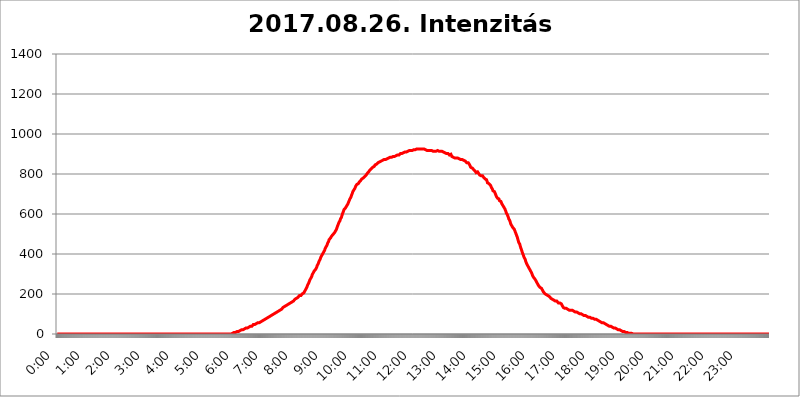
| Category | 2017.08.26. Intenzitás [W/m^2] |
|---|---|
| 0.0 | 0 |
| 0.0006944444444444445 | 0 |
| 0.001388888888888889 | 0 |
| 0.0020833333333333333 | 0 |
| 0.002777777777777778 | 0 |
| 0.003472222222222222 | 0 |
| 0.004166666666666667 | 0 |
| 0.004861111111111111 | 0 |
| 0.005555555555555556 | 0 |
| 0.0062499999999999995 | 0 |
| 0.006944444444444444 | 0 |
| 0.007638888888888889 | 0 |
| 0.008333333333333333 | 0 |
| 0.009027777777777779 | 0 |
| 0.009722222222222222 | 0 |
| 0.010416666666666666 | 0 |
| 0.011111111111111112 | 0 |
| 0.011805555555555555 | 0 |
| 0.012499999999999999 | 0 |
| 0.013194444444444444 | 0 |
| 0.013888888888888888 | 0 |
| 0.014583333333333332 | 0 |
| 0.015277777777777777 | 0 |
| 0.015972222222222224 | 0 |
| 0.016666666666666666 | 0 |
| 0.017361111111111112 | 0 |
| 0.018055555555555557 | 0 |
| 0.01875 | 0 |
| 0.019444444444444445 | 0 |
| 0.02013888888888889 | 0 |
| 0.020833333333333332 | 0 |
| 0.02152777777777778 | 0 |
| 0.022222222222222223 | 0 |
| 0.02291666666666667 | 0 |
| 0.02361111111111111 | 0 |
| 0.024305555555555556 | 0 |
| 0.024999999999999998 | 0 |
| 0.025694444444444447 | 0 |
| 0.02638888888888889 | 0 |
| 0.027083333333333334 | 0 |
| 0.027777777777777776 | 0 |
| 0.02847222222222222 | 0 |
| 0.029166666666666664 | 0 |
| 0.029861111111111113 | 0 |
| 0.030555555555555555 | 0 |
| 0.03125 | 0 |
| 0.03194444444444445 | 0 |
| 0.03263888888888889 | 0 |
| 0.03333333333333333 | 0 |
| 0.034027777777777775 | 0 |
| 0.034722222222222224 | 0 |
| 0.035416666666666666 | 0 |
| 0.036111111111111115 | 0 |
| 0.03680555555555556 | 0 |
| 0.0375 | 0 |
| 0.03819444444444444 | 0 |
| 0.03888888888888889 | 0 |
| 0.03958333333333333 | 0 |
| 0.04027777777777778 | 0 |
| 0.04097222222222222 | 0 |
| 0.041666666666666664 | 0 |
| 0.042361111111111106 | 0 |
| 0.04305555555555556 | 0 |
| 0.043750000000000004 | 0 |
| 0.044444444444444446 | 0 |
| 0.04513888888888889 | 0 |
| 0.04583333333333334 | 0 |
| 0.04652777777777778 | 0 |
| 0.04722222222222222 | 0 |
| 0.04791666666666666 | 0 |
| 0.04861111111111111 | 0 |
| 0.049305555555555554 | 0 |
| 0.049999999999999996 | 0 |
| 0.05069444444444445 | 0 |
| 0.051388888888888894 | 0 |
| 0.052083333333333336 | 0 |
| 0.05277777777777778 | 0 |
| 0.05347222222222222 | 0 |
| 0.05416666666666667 | 0 |
| 0.05486111111111111 | 0 |
| 0.05555555555555555 | 0 |
| 0.05625 | 0 |
| 0.05694444444444444 | 0 |
| 0.057638888888888885 | 0 |
| 0.05833333333333333 | 0 |
| 0.05902777777777778 | 0 |
| 0.059722222222222225 | 0 |
| 0.06041666666666667 | 0 |
| 0.061111111111111116 | 0 |
| 0.06180555555555556 | 0 |
| 0.0625 | 0 |
| 0.06319444444444444 | 0 |
| 0.06388888888888888 | 0 |
| 0.06458333333333334 | 0 |
| 0.06527777777777778 | 0 |
| 0.06597222222222222 | 0 |
| 0.06666666666666667 | 0 |
| 0.06736111111111111 | 0 |
| 0.06805555555555555 | 0 |
| 0.06874999999999999 | 0 |
| 0.06944444444444443 | 0 |
| 0.07013888888888889 | 0 |
| 0.07083333333333333 | 0 |
| 0.07152777777777779 | 0 |
| 0.07222222222222223 | 0 |
| 0.07291666666666667 | 0 |
| 0.07361111111111111 | 0 |
| 0.07430555555555556 | 0 |
| 0.075 | 0 |
| 0.07569444444444444 | 0 |
| 0.0763888888888889 | 0 |
| 0.07708333333333334 | 0 |
| 0.07777777777777778 | 0 |
| 0.07847222222222222 | 0 |
| 0.07916666666666666 | 0 |
| 0.0798611111111111 | 0 |
| 0.08055555555555556 | 0 |
| 0.08125 | 0 |
| 0.08194444444444444 | 0 |
| 0.08263888888888889 | 0 |
| 0.08333333333333333 | 0 |
| 0.08402777777777777 | 0 |
| 0.08472222222222221 | 0 |
| 0.08541666666666665 | 0 |
| 0.08611111111111112 | 0 |
| 0.08680555555555557 | 0 |
| 0.08750000000000001 | 0 |
| 0.08819444444444445 | 0 |
| 0.08888888888888889 | 0 |
| 0.08958333333333333 | 0 |
| 0.09027777777777778 | 0 |
| 0.09097222222222222 | 0 |
| 0.09166666666666667 | 0 |
| 0.09236111111111112 | 0 |
| 0.09305555555555556 | 0 |
| 0.09375 | 0 |
| 0.09444444444444444 | 0 |
| 0.09513888888888888 | 0 |
| 0.09583333333333333 | 0 |
| 0.09652777777777777 | 0 |
| 0.09722222222222222 | 0 |
| 0.09791666666666667 | 0 |
| 0.09861111111111111 | 0 |
| 0.09930555555555555 | 0 |
| 0.09999999999999999 | 0 |
| 0.10069444444444443 | 0 |
| 0.1013888888888889 | 0 |
| 0.10208333333333335 | 0 |
| 0.10277777777777779 | 0 |
| 0.10347222222222223 | 0 |
| 0.10416666666666667 | 0 |
| 0.10486111111111111 | 0 |
| 0.10555555555555556 | 0 |
| 0.10625 | 0 |
| 0.10694444444444444 | 0 |
| 0.1076388888888889 | 0 |
| 0.10833333333333334 | 0 |
| 0.10902777777777778 | 0 |
| 0.10972222222222222 | 0 |
| 0.1111111111111111 | 0 |
| 0.11180555555555556 | 0 |
| 0.11180555555555556 | 0 |
| 0.1125 | 0 |
| 0.11319444444444444 | 0 |
| 0.11388888888888889 | 0 |
| 0.11458333333333333 | 0 |
| 0.11527777777777777 | 0 |
| 0.11597222222222221 | 0 |
| 0.11666666666666665 | 0 |
| 0.1173611111111111 | 0 |
| 0.11805555555555557 | 0 |
| 0.11944444444444445 | 0 |
| 0.12013888888888889 | 0 |
| 0.12083333333333333 | 0 |
| 0.12152777777777778 | 0 |
| 0.12222222222222223 | 0 |
| 0.12291666666666667 | 0 |
| 0.12291666666666667 | 0 |
| 0.12361111111111112 | 0 |
| 0.12430555555555556 | 0 |
| 0.125 | 0 |
| 0.12569444444444444 | 0 |
| 0.12638888888888888 | 0 |
| 0.12708333333333333 | 0 |
| 0.16875 | 0 |
| 0.12847222222222224 | 0 |
| 0.12916666666666668 | 0 |
| 0.12986111111111112 | 0 |
| 0.13055555555555556 | 0 |
| 0.13125 | 0 |
| 0.13194444444444445 | 0 |
| 0.1326388888888889 | 0 |
| 0.13333333333333333 | 0 |
| 0.13402777777777777 | 0 |
| 0.13402777777777777 | 0 |
| 0.13472222222222222 | 0 |
| 0.13541666666666666 | 0 |
| 0.1361111111111111 | 0 |
| 0.13749999999999998 | 0 |
| 0.13819444444444443 | 0 |
| 0.1388888888888889 | 0 |
| 0.13958333333333334 | 0 |
| 0.14027777777777778 | 0 |
| 0.14097222222222222 | 0 |
| 0.14166666666666666 | 0 |
| 0.1423611111111111 | 0 |
| 0.14305555555555557 | 0 |
| 0.14375000000000002 | 0 |
| 0.14444444444444446 | 0 |
| 0.1451388888888889 | 0 |
| 0.1451388888888889 | 0 |
| 0.14652777777777778 | 0 |
| 0.14722222222222223 | 0 |
| 0.14791666666666667 | 0 |
| 0.1486111111111111 | 0 |
| 0.14930555555555555 | 0 |
| 0.15 | 0 |
| 0.15069444444444444 | 0 |
| 0.15138888888888888 | 0 |
| 0.15208333333333332 | 0 |
| 0.15277777777777776 | 0 |
| 0.15347222222222223 | 0 |
| 0.15416666666666667 | 0 |
| 0.15486111111111112 | 0 |
| 0.15555555555555556 | 0 |
| 0.15625 | 0 |
| 0.15694444444444444 | 0 |
| 0.15763888888888888 | 0 |
| 0.15833333333333333 | 0 |
| 0.15902777777777777 | 0 |
| 0.15972222222222224 | 0 |
| 0.16041666666666668 | 0 |
| 0.16111111111111112 | 0 |
| 0.16180555555555556 | 0 |
| 0.1625 | 0 |
| 0.16319444444444445 | 0 |
| 0.1638888888888889 | 0 |
| 0.16458333333333333 | 0 |
| 0.16527777777777777 | 0 |
| 0.16597222222222222 | 0 |
| 0.16666666666666666 | 0 |
| 0.1673611111111111 | 0 |
| 0.16805555555555554 | 0 |
| 0.16874999999999998 | 0 |
| 0.16944444444444443 | 0 |
| 0.17013888888888887 | 0 |
| 0.1708333333333333 | 0 |
| 0.17152777777777775 | 0 |
| 0.17222222222222225 | 0 |
| 0.1729166666666667 | 0 |
| 0.17361111111111113 | 0 |
| 0.17430555555555557 | 0 |
| 0.17500000000000002 | 0 |
| 0.17569444444444446 | 0 |
| 0.1763888888888889 | 0 |
| 0.17708333333333334 | 0 |
| 0.17777777777777778 | 0 |
| 0.17847222222222223 | 0 |
| 0.17916666666666667 | 0 |
| 0.1798611111111111 | 0 |
| 0.18055555555555555 | 0 |
| 0.18125 | 0 |
| 0.18194444444444444 | 0 |
| 0.1826388888888889 | 0 |
| 0.18333333333333335 | 0 |
| 0.1840277777777778 | 0 |
| 0.18472222222222223 | 0 |
| 0.18541666666666667 | 0 |
| 0.18611111111111112 | 0 |
| 0.18680555555555556 | 0 |
| 0.1875 | 0 |
| 0.18819444444444444 | 0 |
| 0.18888888888888888 | 0 |
| 0.18958333333333333 | 0 |
| 0.19027777777777777 | 0 |
| 0.1909722222222222 | 0 |
| 0.19166666666666665 | 0 |
| 0.19236111111111112 | 0 |
| 0.19305555555555554 | 0 |
| 0.19375 | 0 |
| 0.19444444444444445 | 0 |
| 0.1951388888888889 | 0 |
| 0.19583333333333333 | 0 |
| 0.19652777777777777 | 0 |
| 0.19722222222222222 | 0 |
| 0.19791666666666666 | 0 |
| 0.1986111111111111 | 0 |
| 0.19930555555555554 | 0 |
| 0.19999999999999998 | 0 |
| 0.20069444444444443 | 0 |
| 0.20138888888888887 | 0 |
| 0.2020833333333333 | 0 |
| 0.2027777777777778 | 0 |
| 0.2034722222222222 | 0 |
| 0.2041666666666667 | 0 |
| 0.20486111111111113 | 0 |
| 0.20555555555555557 | 0 |
| 0.20625000000000002 | 0 |
| 0.20694444444444446 | 0 |
| 0.2076388888888889 | 0 |
| 0.20833333333333334 | 0 |
| 0.20902777777777778 | 0 |
| 0.20972222222222223 | 0 |
| 0.21041666666666667 | 0 |
| 0.2111111111111111 | 0 |
| 0.21180555555555555 | 0 |
| 0.2125 | 0 |
| 0.21319444444444444 | 0 |
| 0.2138888888888889 | 0 |
| 0.21458333333333335 | 0 |
| 0.2152777777777778 | 0 |
| 0.21597222222222223 | 0 |
| 0.21666666666666667 | 0 |
| 0.21736111111111112 | 0 |
| 0.21805555555555556 | 0 |
| 0.21875 | 0 |
| 0.21944444444444444 | 0 |
| 0.22013888888888888 | 0 |
| 0.22083333333333333 | 0 |
| 0.22152777777777777 | 0 |
| 0.2222222222222222 | 0 |
| 0.22291666666666665 | 0 |
| 0.2236111111111111 | 0 |
| 0.22430555555555556 | 0 |
| 0.225 | 0 |
| 0.22569444444444445 | 0 |
| 0.2263888888888889 | 0 |
| 0.22708333333333333 | 0 |
| 0.22777777777777777 | 0 |
| 0.22847222222222222 | 0 |
| 0.22916666666666666 | 0 |
| 0.2298611111111111 | 0 |
| 0.23055555555555554 | 0 |
| 0.23124999999999998 | 0 |
| 0.23194444444444443 | 0 |
| 0.23263888888888887 | 0 |
| 0.2333333333333333 | 0 |
| 0.2340277777777778 | 0 |
| 0.2347222222222222 | 0 |
| 0.2354166666666667 | 0 |
| 0.23611111111111113 | 0 |
| 0.23680555555555557 | 0 |
| 0.23750000000000002 | 0 |
| 0.23819444444444446 | 0 |
| 0.2388888888888889 | 0 |
| 0.23958333333333334 | 0 |
| 0.24027777777777778 | 0 |
| 0.24097222222222223 | 0 |
| 0.24166666666666667 | 0 |
| 0.2423611111111111 | 0 |
| 0.24305555555555555 | 0 |
| 0.24375 | 0 |
| 0.24444444444444446 | 3.525 |
| 0.24513888888888888 | 3.525 |
| 0.24583333333333335 | 3.525 |
| 0.2465277777777778 | 3.525 |
| 0.24722222222222223 | 3.525 |
| 0.24791666666666667 | 7.887 |
| 0.24861111111111112 | 7.887 |
| 0.24930555555555556 | 7.887 |
| 0.25 | 7.887 |
| 0.25069444444444444 | 12.257 |
| 0.2513888888888889 | 12.257 |
| 0.2520833333333333 | 12.257 |
| 0.25277777777777777 | 12.257 |
| 0.2534722222222222 | 12.257 |
| 0.25416666666666665 | 12.257 |
| 0.2548611111111111 | 16.636 |
| 0.2555555555555556 | 16.636 |
| 0.25625000000000003 | 16.636 |
| 0.2569444444444445 | 16.636 |
| 0.2576388888888889 | 21.024 |
| 0.25833333333333336 | 21.024 |
| 0.2590277777777778 | 21.024 |
| 0.25972222222222224 | 21.024 |
| 0.2604166666666667 | 21.024 |
| 0.2611111111111111 | 21.024 |
| 0.26180555555555557 | 25.419 |
| 0.2625 | 25.419 |
| 0.26319444444444445 | 25.419 |
| 0.2638888888888889 | 29.823 |
| 0.26458333333333334 | 29.823 |
| 0.2652777777777778 | 29.823 |
| 0.2659722222222222 | 29.823 |
| 0.26666666666666666 | 29.823 |
| 0.2673611111111111 | 34.234 |
| 0.26805555555555555 | 34.234 |
| 0.26875 | 34.234 |
| 0.26944444444444443 | 38.653 |
| 0.2701388888888889 | 38.653 |
| 0.2708333333333333 | 38.653 |
| 0.27152777777777776 | 38.653 |
| 0.2722222222222222 | 38.653 |
| 0.27291666666666664 | 38.653 |
| 0.2736111111111111 | 43.079 |
| 0.2743055555555555 | 43.079 |
| 0.27499999999999997 | 47.511 |
| 0.27569444444444446 | 47.511 |
| 0.27638888888888885 | 47.511 |
| 0.27708333333333335 | 47.511 |
| 0.2777777777777778 | 47.511 |
| 0.27847222222222223 | 51.951 |
| 0.2791666666666667 | 51.951 |
| 0.2798611111111111 | 51.951 |
| 0.28055555555555556 | 51.951 |
| 0.28125 | 56.398 |
| 0.28194444444444444 | 56.398 |
| 0.2826388888888889 | 56.398 |
| 0.2833333333333333 | 56.398 |
| 0.28402777777777777 | 60.85 |
| 0.2847222222222222 | 60.85 |
| 0.28541666666666665 | 60.85 |
| 0.28611111111111115 | 65.31 |
| 0.28680555555555554 | 65.31 |
| 0.28750000000000003 | 65.31 |
| 0.2881944444444445 | 69.775 |
| 0.2888888888888889 | 69.775 |
| 0.28958333333333336 | 69.775 |
| 0.2902777777777778 | 74.246 |
| 0.29097222222222224 | 74.246 |
| 0.2916666666666667 | 74.246 |
| 0.2923611111111111 | 74.246 |
| 0.29305555555555557 | 78.722 |
| 0.29375 | 78.722 |
| 0.29444444444444445 | 78.722 |
| 0.2951388888888889 | 83.205 |
| 0.29583333333333334 | 83.205 |
| 0.2965277777777778 | 83.205 |
| 0.2972222222222222 | 83.205 |
| 0.29791666666666666 | 87.692 |
| 0.2986111111111111 | 87.692 |
| 0.29930555555555555 | 92.184 |
| 0.3 | 92.184 |
| 0.30069444444444443 | 92.184 |
| 0.3013888888888889 | 92.184 |
| 0.3020833333333333 | 96.682 |
| 0.30277777777777776 | 96.682 |
| 0.3034722222222222 | 101.184 |
| 0.30416666666666664 | 101.184 |
| 0.3048611111111111 | 101.184 |
| 0.3055555555555555 | 101.184 |
| 0.30624999999999997 | 105.69 |
| 0.3069444444444444 | 105.69 |
| 0.3076388888888889 | 110.201 |
| 0.30833333333333335 | 110.201 |
| 0.3090277777777778 | 110.201 |
| 0.30972222222222223 | 114.716 |
| 0.3104166666666667 | 114.716 |
| 0.3111111111111111 | 119.235 |
| 0.31180555555555556 | 119.235 |
| 0.3125 | 119.235 |
| 0.31319444444444444 | 123.758 |
| 0.3138888888888889 | 123.758 |
| 0.3145833333333333 | 123.758 |
| 0.31527777777777777 | 128.284 |
| 0.3159722222222222 | 128.284 |
| 0.31666666666666665 | 132.814 |
| 0.31736111111111115 | 132.814 |
| 0.31805555555555554 | 132.814 |
| 0.31875000000000003 | 137.347 |
| 0.3194444444444445 | 137.347 |
| 0.3201388888888889 | 137.347 |
| 0.32083333333333336 | 141.884 |
| 0.3215277777777778 | 141.884 |
| 0.32222222222222224 | 146.423 |
| 0.3229166666666667 | 146.423 |
| 0.3236111111111111 | 146.423 |
| 0.32430555555555557 | 150.964 |
| 0.325 | 150.964 |
| 0.32569444444444445 | 150.964 |
| 0.3263888888888889 | 155.509 |
| 0.32708333333333334 | 155.509 |
| 0.3277777777777778 | 155.509 |
| 0.3284722222222222 | 160.056 |
| 0.32916666666666666 | 160.056 |
| 0.3298611111111111 | 164.605 |
| 0.33055555555555555 | 164.605 |
| 0.33125 | 164.605 |
| 0.33194444444444443 | 169.156 |
| 0.3326388888888889 | 169.156 |
| 0.3333333333333333 | 173.709 |
| 0.3340277777777778 | 173.709 |
| 0.3347222222222222 | 178.264 |
| 0.3354166666666667 | 178.264 |
| 0.3361111111111111 | 178.264 |
| 0.3368055555555556 | 182.82 |
| 0.33749999999999997 | 182.82 |
| 0.33819444444444446 | 187.378 |
| 0.33888888888888885 | 187.378 |
| 0.33958333333333335 | 191.937 |
| 0.34027777777777773 | 191.937 |
| 0.34097222222222223 | 191.937 |
| 0.3416666666666666 | 191.937 |
| 0.3423611111111111 | 196.497 |
| 0.3430555555555555 | 196.497 |
| 0.34375 | 201.058 |
| 0.3444444444444445 | 201.058 |
| 0.3451388888888889 | 201.058 |
| 0.3458333333333334 | 205.62 |
| 0.34652777777777777 | 210.182 |
| 0.34722222222222227 | 214.746 |
| 0.34791666666666665 | 219.309 |
| 0.34861111111111115 | 223.873 |
| 0.34930555555555554 | 228.436 |
| 0.35000000000000003 | 233 |
| 0.3506944444444444 | 237.564 |
| 0.3513888888888889 | 246.689 |
| 0.3520833333333333 | 251.251 |
| 0.3527777777777778 | 255.813 |
| 0.3534722222222222 | 260.373 |
| 0.3541666666666667 | 269.49 |
| 0.3548611111111111 | 274.047 |
| 0.35555555555555557 | 278.603 |
| 0.35625 | 283.156 |
| 0.35694444444444445 | 287.709 |
| 0.3576388888888889 | 296.808 |
| 0.35833333333333334 | 301.354 |
| 0.3590277777777778 | 305.898 |
| 0.3597222222222222 | 310.44 |
| 0.36041666666666666 | 314.98 |
| 0.3611111111111111 | 314.98 |
| 0.36180555555555555 | 319.517 |
| 0.3625 | 324.052 |
| 0.36319444444444443 | 328.584 |
| 0.3638888888888889 | 333.113 |
| 0.3645833333333333 | 342.162 |
| 0.3652777777777778 | 346.682 |
| 0.3659722222222222 | 351.198 |
| 0.3666666666666667 | 355.712 |
| 0.3673611111111111 | 364.728 |
| 0.3680555555555556 | 369.23 |
| 0.36874999999999997 | 373.729 |
| 0.36944444444444446 | 382.715 |
| 0.37013888888888885 | 387.202 |
| 0.37083333333333335 | 391.685 |
| 0.37152777777777773 | 396.164 |
| 0.37222222222222223 | 400.638 |
| 0.3729166666666666 | 405.108 |
| 0.3736111111111111 | 409.574 |
| 0.3743055555555555 | 414.035 |
| 0.375 | 418.492 |
| 0.3756944444444445 | 427.39 |
| 0.3763888888888889 | 431.833 |
| 0.3770833333333334 | 436.27 |
| 0.37777777777777777 | 440.702 |
| 0.37847222222222227 | 445.129 |
| 0.37916666666666665 | 453.968 |
| 0.37986111111111115 | 458.38 |
| 0.38055555555555554 | 462.786 |
| 0.38125000000000003 | 471.582 |
| 0.3819444444444444 | 475.972 |
| 0.3826388888888889 | 475.972 |
| 0.3833333333333333 | 480.356 |
| 0.3840277777777778 | 480.356 |
| 0.3847222222222222 | 489.108 |
| 0.3854166666666667 | 489.108 |
| 0.3861111111111111 | 493.475 |
| 0.38680555555555557 | 497.836 |
| 0.3875 | 497.836 |
| 0.38819444444444445 | 502.192 |
| 0.3888888888888889 | 506.542 |
| 0.38958333333333334 | 510.885 |
| 0.3902777777777778 | 515.223 |
| 0.3909722222222222 | 519.555 |
| 0.39166666666666666 | 523.88 |
| 0.3923611111111111 | 532.513 |
| 0.39305555555555555 | 536.82 |
| 0.39375 | 545.416 |
| 0.39444444444444443 | 549.704 |
| 0.3951388888888889 | 558.261 |
| 0.3958333333333333 | 562.53 |
| 0.3965277777777778 | 566.793 |
| 0.3972222222222222 | 575.299 |
| 0.3979166666666667 | 579.542 |
| 0.3986111111111111 | 583.779 |
| 0.3993055555555556 | 592.233 |
| 0.39999999999999997 | 600.661 |
| 0.40069444444444446 | 604.864 |
| 0.40138888888888885 | 613.252 |
| 0.40208333333333335 | 621.613 |
| 0.40277777777777773 | 625.784 |
| 0.40347222222222223 | 625.784 |
| 0.4041666666666666 | 629.948 |
| 0.4048611111111111 | 634.105 |
| 0.4055555555555555 | 634.105 |
| 0.40625 | 642.4 |
| 0.4069444444444445 | 646.537 |
| 0.4076388888888889 | 650.667 |
| 0.4083333333333334 | 654.791 |
| 0.40902777777777777 | 663.019 |
| 0.40972222222222227 | 667.123 |
| 0.41041666666666665 | 675.311 |
| 0.41111111111111115 | 679.395 |
| 0.41180555555555554 | 683.473 |
| 0.41250000000000003 | 691.608 |
| 0.4131944444444444 | 695.666 |
| 0.4138888888888889 | 703.762 |
| 0.4145833333333333 | 711.832 |
| 0.4152777777777778 | 715.858 |
| 0.4159722222222222 | 719.877 |
| 0.4166666666666667 | 723.889 |
| 0.4173611111111111 | 727.896 |
| 0.41805555555555557 | 731.896 |
| 0.41875 | 739.877 |
| 0.41944444444444445 | 743.859 |
| 0.4201388888888889 | 747.834 |
| 0.42083333333333334 | 747.834 |
| 0.4215277777777778 | 751.803 |
| 0.4222222222222222 | 751.803 |
| 0.42291666666666666 | 755.766 |
| 0.4236111111111111 | 759.723 |
| 0.42430555555555555 | 759.723 |
| 0.425 | 763.674 |
| 0.42569444444444443 | 767.62 |
| 0.4263888888888889 | 771.559 |
| 0.4270833333333333 | 775.492 |
| 0.4277777777777778 | 775.492 |
| 0.4284722222222222 | 775.492 |
| 0.4291666666666667 | 779.42 |
| 0.4298611111111111 | 783.342 |
| 0.4305555555555556 | 783.342 |
| 0.43124999999999997 | 787.258 |
| 0.43194444444444446 | 791.169 |
| 0.43263888888888885 | 791.169 |
| 0.43333333333333335 | 795.074 |
| 0.43402777777777773 | 798.974 |
| 0.43472222222222223 | 802.868 |
| 0.4354166666666666 | 806.757 |
| 0.4361111111111111 | 806.757 |
| 0.4368055555555555 | 810.641 |
| 0.4375 | 814.519 |
| 0.4381944444444445 | 818.392 |
| 0.4388888888888889 | 822.26 |
| 0.4395833333333334 | 822.26 |
| 0.44027777777777777 | 826.123 |
| 0.44097222222222227 | 826.123 |
| 0.44166666666666665 | 829.981 |
| 0.44236111111111115 | 833.834 |
| 0.44305555555555554 | 833.834 |
| 0.44375000000000003 | 837.682 |
| 0.4444444444444444 | 837.682 |
| 0.4451388888888889 | 841.526 |
| 0.4458333333333333 | 845.365 |
| 0.4465277777777778 | 845.365 |
| 0.4472222222222222 | 849.199 |
| 0.4479166666666667 | 849.199 |
| 0.4486111111111111 | 849.199 |
| 0.44930555555555557 | 853.029 |
| 0.45 | 856.855 |
| 0.45069444444444445 | 860.676 |
| 0.4513888888888889 | 860.676 |
| 0.45208333333333334 | 860.676 |
| 0.4527777777777778 | 860.676 |
| 0.4534722222222222 | 864.493 |
| 0.45416666666666666 | 864.493 |
| 0.4548611111111111 | 864.493 |
| 0.45555555555555555 | 868.305 |
| 0.45625 | 868.305 |
| 0.45694444444444443 | 868.305 |
| 0.4576388888888889 | 872.114 |
| 0.4583333333333333 | 872.114 |
| 0.4590277777777778 | 872.114 |
| 0.4597222222222222 | 875.918 |
| 0.4604166666666667 | 872.114 |
| 0.4611111111111111 | 875.918 |
| 0.4618055555555556 | 875.918 |
| 0.46249999999999997 | 875.918 |
| 0.46319444444444446 | 875.918 |
| 0.46388888888888885 | 879.719 |
| 0.46458333333333335 | 879.719 |
| 0.46527777777777773 | 883.516 |
| 0.46597222222222223 | 879.719 |
| 0.4666666666666666 | 883.516 |
| 0.4673611111111111 | 883.516 |
| 0.4680555555555555 | 883.516 |
| 0.46875 | 883.516 |
| 0.4694444444444445 | 887.309 |
| 0.4701388888888889 | 887.309 |
| 0.4708333333333334 | 887.309 |
| 0.47152777777777777 | 887.309 |
| 0.47222222222222227 | 887.309 |
| 0.47291666666666665 | 887.309 |
| 0.47361111111111115 | 887.309 |
| 0.47430555555555554 | 887.309 |
| 0.47500000000000003 | 891.099 |
| 0.4756944444444444 | 894.885 |
| 0.4763888888888889 | 894.885 |
| 0.4770833333333333 | 894.885 |
| 0.4777777777777778 | 894.885 |
| 0.4784722222222222 | 894.885 |
| 0.4791666666666667 | 894.885 |
| 0.4798611111111111 | 898.668 |
| 0.48055555555555557 | 898.668 |
| 0.48125 | 902.447 |
| 0.48194444444444445 | 902.447 |
| 0.4826388888888889 | 902.447 |
| 0.48333333333333334 | 902.447 |
| 0.4840277777777778 | 902.447 |
| 0.4847222222222222 | 906.223 |
| 0.48541666666666666 | 906.223 |
| 0.4861111111111111 | 906.223 |
| 0.48680555555555555 | 909.996 |
| 0.4875 | 909.996 |
| 0.48819444444444443 | 909.996 |
| 0.4888888888888889 | 909.996 |
| 0.4895833333333333 | 909.996 |
| 0.4902777777777778 | 913.766 |
| 0.4909722222222222 | 913.766 |
| 0.4916666666666667 | 913.766 |
| 0.4923611111111111 | 917.534 |
| 0.4930555555555556 | 917.534 |
| 0.49374999999999997 | 917.534 |
| 0.49444444444444446 | 917.534 |
| 0.49513888888888885 | 917.534 |
| 0.49583333333333335 | 917.534 |
| 0.49652777777777773 | 917.534 |
| 0.49722222222222223 | 917.534 |
| 0.4979166666666666 | 917.534 |
| 0.4986111111111111 | 921.298 |
| 0.4993055555555555 | 921.298 |
| 0.5 | 921.298 |
| 0.5006944444444444 | 921.298 |
| 0.5013888888888889 | 921.298 |
| 0.5020833333333333 | 921.298 |
| 0.5027777777777778 | 925.06 |
| 0.5034722222222222 | 921.298 |
| 0.5041666666666667 | 925.06 |
| 0.5048611111111111 | 925.06 |
| 0.5055555555555555 | 925.06 |
| 0.50625 | 925.06 |
| 0.5069444444444444 | 925.06 |
| 0.5076388888888889 | 925.06 |
| 0.5083333333333333 | 925.06 |
| 0.5090277777777777 | 928.819 |
| 0.5097222222222222 | 925.06 |
| 0.5104166666666666 | 925.06 |
| 0.5111111111111112 | 925.06 |
| 0.5118055555555555 | 925.06 |
| 0.5125000000000001 | 925.06 |
| 0.5131944444444444 | 925.06 |
| 0.513888888888889 | 925.06 |
| 0.5145833333333333 | 925.06 |
| 0.5152777777777778 | 921.298 |
| 0.5159722222222222 | 921.298 |
| 0.5166666666666667 | 921.298 |
| 0.517361111111111 | 921.298 |
| 0.5180555555555556 | 921.298 |
| 0.5187499999999999 | 917.534 |
| 0.5194444444444445 | 917.534 |
| 0.5201388888888888 | 917.534 |
| 0.5208333333333334 | 917.534 |
| 0.5215277777777778 | 917.534 |
| 0.5222222222222223 | 917.534 |
| 0.5229166666666667 | 917.534 |
| 0.5236111111111111 | 917.534 |
| 0.5243055555555556 | 917.534 |
| 0.525 | 917.534 |
| 0.5256944444444445 | 917.534 |
| 0.5263888888888889 | 913.766 |
| 0.5270833333333333 | 913.766 |
| 0.5277777777777778 | 913.766 |
| 0.5284722222222222 | 913.766 |
| 0.5291666666666667 | 913.766 |
| 0.5298611111111111 | 913.766 |
| 0.5305555555555556 | 913.766 |
| 0.53125 | 913.766 |
| 0.5319444444444444 | 917.534 |
| 0.5326388888888889 | 917.534 |
| 0.5333333333333333 | 917.534 |
| 0.5340277777777778 | 913.766 |
| 0.5347222222222222 | 913.766 |
| 0.5354166666666667 | 913.766 |
| 0.5361111111111111 | 913.766 |
| 0.5368055555555555 | 913.766 |
| 0.5375 | 913.766 |
| 0.5381944444444444 | 913.766 |
| 0.5388888888888889 | 913.766 |
| 0.5395833333333333 | 913.766 |
| 0.5402777777777777 | 909.996 |
| 0.5409722222222222 | 909.996 |
| 0.5416666666666666 | 909.996 |
| 0.5423611111111112 | 909.996 |
| 0.5430555555555555 | 906.223 |
| 0.5437500000000001 | 906.223 |
| 0.5444444444444444 | 902.447 |
| 0.545138888888889 | 902.447 |
| 0.5458333333333333 | 902.447 |
| 0.5465277777777778 | 902.447 |
| 0.5472222222222222 | 902.447 |
| 0.5479166666666667 | 902.447 |
| 0.548611111111111 | 902.447 |
| 0.5493055555555556 | 898.668 |
| 0.5499999999999999 | 894.885 |
| 0.5506944444444445 | 894.885 |
| 0.5513888888888888 | 894.885 |
| 0.5520833333333334 | 898.668 |
| 0.5527777777777778 | 894.885 |
| 0.5534722222222223 | 887.309 |
| 0.5541666666666667 | 887.309 |
| 0.5548611111111111 | 883.516 |
| 0.5555555555555556 | 883.516 |
| 0.55625 | 883.516 |
| 0.5569444444444445 | 883.516 |
| 0.5576388888888889 | 879.719 |
| 0.5583333333333333 | 875.918 |
| 0.5590277777777778 | 879.719 |
| 0.5597222222222222 | 879.719 |
| 0.5604166666666667 | 879.719 |
| 0.5611111111111111 | 879.719 |
| 0.5618055555555556 | 879.719 |
| 0.5625 | 879.719 |
| 0.5631944444444444 | 879.719 |
| 0.5638888888888889 | 875.918 |
| 0.5645833333333333 | 875.918 |
| 0.5652777777777778 | 875.918 |
| 0.5659722222222222 | 872.114 |
| 0.5666666666666667 | 875.918 |
| 0.5673611111111111 | 875.918 |
| 0.5680555555555555 | 872.114 |
| 0.56875 | 872.114 |
| 0.5694444444444444 | 868.305 |
| 0.5701388888888889 | 868.305 |
| 0.5708333333333333 | 868.305 |
| 0.5715277777777777 | 864.493 |
| 0.5722222222222222 | 864.493 |
| 0.5729166666666666 | 860.676 |
| 0.5736111111111112 | 860.676 |
| 0.5743055555555555 | 856.855 |
| 0.5750000000000001 | 856.855 |
| 0.5756944444444444 | 856.855 |
| 0.576388888888889 | 856.855 |
| 0.5770833333333333 | 853.029 |
| 0.5777777777777778 | 853.029 |
| 0.5784722222222222 | 845.365 |
| 0.5791666666666667 | 841.526 |
| 0.579861111111111 | 833.834 |
| 0.5805555555555556 | 833.834 |
| 0.5812499999999999 | 833.834 |
| 0.5819444444444445 | 829.981 |
| 0.5826388888888888 | 826.123 |
| 0.5833333333333334 | 826.123 |
| 0.5840277777777778 | 822.26 |
| 0.5847222222222223 | 818.392 |
| 0.5854166666666667 | 818.392 |
| 0.5861111111111111 | 814.519 |
| 0.5868055555555556 | 810.641 |
| 0.5875 | 806.757 |
| 0.5881944444444445 | 806.757 |
| 0.5888888888888889 | 810.641 |
| 0.5895833333333333 | 810.641 |
| 0.5902777777777778 | 806.757 |
| 0.5909722222222222 | 802.868 |
| 0.5916666666666667 | 798.974 |
| 0.5923611111111111 | 795.074 |
| 0.5930555555555556 | 795.074 |
| 0.59375 | 795.074 |
| 0.5944444444444444 | 791.169 |
| 0.5951388888888889 | 791.169 |
| 0.5958333333333333 | 787.258 |
| 0.5965277777777778 | 791.169 |
| 0.5972222222222222 | 787.258 |
| 0.5979166666666667 | 783.342 |
| 0.5986111111111111 | 779.42 |
| 0.5993055555555555 | 779.42 |
| 0.6 | 775.492 |
| 0.6006944444444444 | 775.492 |
| 0.6013888888888889 | 775.492 |
| 0.6020833333333333 | 771.559 |
| 0.6027777777777777 | 763.674 |
| 0.6034722222222222 | 755.766 |
| 0.6041666666666666 | 755.766 |
| 0.6048611111111112 | 751.803 |
| 0.6055555555555555 | 751.803 |
| 0.6062500000000001 | 751.803 |
| 0.6069444444444444 | 747.834 |
| 0.607638888888889 | 743.859 |
| 0.6083333333333333 | 739.877 |
| 0.6090277777777778 | 731.896 |
| 0.6097222222222222 | 727.896 |
| 0.6104166666666667 | 723.889 |
| 0.611111111111111 | 715.858 |
| 0.6118055555555556 | 719.877 |
| 0.6124999999999999 | 711.832 |
| 0.6131944444444445 | 711.832 |
| 0.6138888888888888 | 707.8 |
| 0.6145833333333334 | 699.717 |
| 0.6152777777777778 | 695.666 |
| 0.6159722222222223 | 687.544 |
| 0.6166666666666667 | 683.473 |
| 0.6173611111111111 | 679.395 |
| 0.6180555555555556 | 675.311 |
| 0.61875 | 675.311 |
| 0.6194444444444445 | 675.311 |
| 0.6201388888888889 | 667.123 |
| 0.6208333333333333 | 667.123 |
| 0.6215277777777778 | 663.019 |
| 0.6222222222222222 | 663.019 |
| 0.6229166666666667 | 658.909 |
| 0.6236111111111111 | 650.667 |
| 0.6243055555555556 | 646.537 |
| 0.625 | 642.4 |
| 0.6256944444444444 | 638.256 |
| 0.6263888888888889 | 634.105 |
| 0.6270833333333333 | 634.105 |
| 0.6277777777777778 | 625.784 |
| 0.6284722222222222 | 621.613 |
| 0.6291666666666667 | 613.252 |
| 0.6298611111111111 | 604.864 |
| 0.6305555555555555 | 600.661 |
| 0.63125 | 596.45 |
| 0.6319444444444444 | 592.233 |
| 0.6326388888888889 | 583.779 |
| 0.6333333333333333 | 575.299 |
| 0.6340277777777777 | 575.299 |
| 0.6347222222222222 | 566.793 |
| 0.6354166666666666 | 562.53 |
| 0.6361111111111112 | 549.704 |
| 0.6368055555555555 | 545.416 |
| 0.6375000000000001 | 541.121 |
| 0.6381944444444444 | 536.82 |
| 0.638888888888889 | 532.513 |
| 0.6395833333333333 | 528.2 |
| 0.6402777777777778 | 528.2 |
| 0.6409722222222222 | 523.88 |
| 0.6416666666666667 | 519.555 |
| 0.642361111111111 | 510.885 |
| 0.6430555555555556 | 506.542 |
| 0.6437499999999999 | 497.836 |
| 0.6444444444444445 | 493.475 |
| 0.6451388888888888 | 484.735 |
| 0.6458333333333334 | 475.972 |
| 0.6465277777777778 | 467.187 |
| 0.6472222222222223 | 458.38 |
| 0.6479166666666667 | 453.968 |
| 0.6486111111111111 | 449.551 |
| 0.6493055555555556 | 440.702 |
| 0.65 | 431.833 |
| 0.6506944444444445 | 427.39 |
| 0.6513888888888889 | 418.492 |
| 0.6520833333333333 | 409.574 |
| 0.6527777777777778 | 405.108 |
| 0.6534722222222222 | 396.164 |
| 0.6541666666666667 | 391.685 |
| 0.6548611111111111 | 382.715 |
| 0.6555555555555556 | 378.224 |
| 0.65625 | 373.729 |
| 0.6569444444444444 | 364.728 |
| 0.6576388888888889 | 360.221 |
| 0.6583333333333333 | 351.198 |
| 0.6590277777777778 | 351.198 |
| 0.6597222222222222 | 342.162 |
| 0.6604166666666667 | 337.639 |
| 0.6611111111111111 | 333.113 |
| 0.6618055555555555 | 328.584 |
| 0.6625 | 324.052 |
| 0.6631944444444444 | 319.517 |
| 0.6638888888888889 | 314.98 |
| 0.6645833333333333 | 310.44 |
| 0.6652777777777777 | 305.898 |
| 0.6659722222222222 | 301.354 |
| 0.6666666666666666 | 292.259 |
| 0.6673611111111111 | 287.709 |
| 0.6680555555555556 | 283.156 |
| 0.6687500000000001 | 278.603 |
| 0.6694444444444444 | 278.603 |
| 0.6701388888888888 | 274.047 |
| 0.6708333333333334 | 269.49 |
| 0.6715277777777778 | 264.932 |
| 0.6722222222222222 | 260.373 |
| 0.6729166666666666 | 260.373 |
| 0.6736111111111112 | 251.251 |
| 0.6743055555555556 | 246.689 |
| 0.6749999999999999 | 242.127 |
| 0.6756944444444444 | 242.127 |
| 0.6763888888888889 | 237.564 |
| 0.6770833333333334 | 233 |
| 0.6777777777777777 | 233 |
| 0.6784722222222223 | 228.436 |
| 0.6791666666666667 | 228.436 |
| 0.6798611111111111 | 223.873 |
| 0.6805555555555555 | 219.309 |
| 0.68125 | 214.746 |
| 0.6819444444444445 | 210.182 |
| 0.6826388888888889 | 210.182 |
| 0.6833333333333332 | 205.62 |
| 0.6840277777777778 | 201.058 |
| 0.6847222222222222 | 201.058 |
| 0.6854166666666667 | 201.058 |
| 0.686111111111111 | 196.497 |
| 0.6868055555555556 | 196.497 |
| 0.6875 | 191.937 |
| 0.6881944444444444 | 191.937 |
| 0.688888888888889 | 187.378 |
| 0.6895833333333333 | 187.378 |
| 0.6902777777777778 | 187.378 |
| 0.6909722222222222 | 182.82 |
| 0.6916666666666668 | 182.82 |
| 0.6923611111111111 | 178.264 |
| 0.6930555555555555 | 178.264 |
| 0.69375 | 178.264 |
| 0.6944444444444445 | 173.709 |
| 0.6951388888888889 | 173.709 |
| 0.6958333333333333 | 173.709 |
| 0.6965277777777777 | 169.156 |
| 0.6972222222222223 | 169.156 |
| 0.6979166666666666 | 164.605 |
| 0.6986111111111111 | 164.605 |
| 0.6993055555555556 | 164.605 |
| 0.7000000000000001 | 164.605 |
| 0.7006944444444444 | 164.605 |
| 0.7013888888888888 | 160.056 |
| 0.7020833333333334 | 160.056 |
| 0.7027777777777778 | 155.509 |
| 0.7034722222222222 | 155.509 |
| 0.7041666666666666 | 155.509 |
| 0.7048611111111112 | 155.509 |
| 0.7055555555555556 | 150.964 |
| 0.7062499999999999 | 150.964 |
| 0.7069444444444444 | 150.964 |
| 0.7076388888888889 | 146.423 |
| 0.7083333333333334 | 141.884 |
| 0.7090277777777777 | 137.347 |
| 0.7097222222222223 | 132.814 |
| 0.7104166666666667 | 132.814 |
| 0.7111111111111111 | 132.814 |
| 0.7118055555555555 | 128.284 |
| 0.7125 | 128.284 |
| 0.7131944444444445 | 128.284 |
| 0.7138888888888889 | 128.284 |
| 0.7145833333333332 | 128.284 |
| 0.7152777777777778 | 123.758 |
| 0.7159722222222222 | 123.758 |
| 0.7166666666666667 | 123.758 |
| 0.717361111111111 | 123.758 |
| 0.7180555555555556 | 119.235 |
| 0.71875 | 119.235 |
| 0.7194444444444444 | 119.235 |
| 0.720138888888889 | 119.235 |
| 0.7208333333333333 | 119.235 |
| 0.7215277777777778 | 119.235 |
| 0.7222222222222222 | 119.235 |
| 0.7229166666666668 | 114.716 |
| 0.7236111111111111 | 114.716 |
| 0.7243055555555555 | 114.716 |
| 0.725 | 110.201 |
| 0.7256944444444445 | 110.201 |
| 0.7263888888888889 | 110.201 |
| 0.7270833333333333 | 110.201 |
| 0.7277777777777777 | 110.201 |
| 0.7284722222222223 | 110.201 |
| 0.7291666666666666 | 105.69 |
| 0.7298611111111111 | 105.69 |
| 0.7305555555555556 | 105.69 |
| 0.7312500000000001 | 105.69 |
| 0.7319444444444444 | 105.69 |
| 0.7326388888888888 | 101.184 |
| 0.7333333333333334 | 101.184 |
| 0.7340277777777778 | 101.184 |
| 0.7347222222222222 | 101.184 |
| 0.7354166666666666 | 96.682 |
| 0.7361111111111112 | 96.682 |
| 0.7368055555555556 | 96.682 |
| 0.7374999999999999 | 96.682 |
| 0.7381944444444444 | 92.184 |
| 0.7388888888888889 | 92.184 |
| 0.7395833333333334 | 92.184 |
| 0.7402777777777777 | 92.184 |
| 0.7409722222222223 | 92.184 |
| 0.7416666666666667 | 87.692 |
| 0.7423611111111111 | 87.692 |
| 0.7430555555555555 | 87.692 |
| 0.74375 | 87.692 |
| 0.7444444444444445 | 83.205 |
| 0.7451388888888889 | 83.205 |
| 0.7458333333333332 | 83.205 |
| 0.7465277777777778 | 83.205 |
| 0.7472222222222222 | 83.205 |
| 0.7479166666666667 | 83.205 |
| 0.748611111111111 | 83.205 |
| 0.7493055555555556 | 78.722 |
| 0.75 | 78.722 |
| 0.7506944444444444 | 78.722 |
| 0.751388888888889 | 78.722 |
| 0.7520833333333333 | 74.246 |
| 0.7527777777777778 | 74.246 |
| 0.7534722222222222 | 74.246 |
| 0.7541666666666668 | 74.246 |
| 0.7548611111111111 | 74.246 |
| 0.7555555555555555 | 74.246 |
| 0.75625 | 69.775 |
| 0.7569444444444445 | 69.775 |
| 0.7576388888888889 | 69.775 |
| 0.7583333333333333 | 65.31 |
| 0.7590277777777777 | 65.31 |
| 0.7597222222222223 | 65.31 |
| 0.7604166666666666 | 65.31 |
| 0.7611111111111111 | 65.31 |
| 0.7618055555555556 | 60.85 |
| 0.7625000000000001 | 60.85 |
| 0.7631944444444444 | 60.85 |
| 0.7638888888888888 | 56.398 |
| 0.7645833333333334 | 56.398 |
| 0.7652777777777778 | 56.398 |
| 0.7659722222222222 | 56.398 |
| 0.7666666666666666 | 56.398 |
| 0.7673611111111112 | 51.951 |
| 0.7680555555555556 | 51.951 |
| 0.7687499999999999 | 51.951 |
| 0.7694444444444444 | 47.511 |
| 0.7701388888888889 | 47.511 |
| 0.7708333333333334 | 47.511 |
| 0.7715277777777777 | 47.511 |
| 0.7722222222222223 | 43.079 |
| 0.7729166666666667 | 43.079 |
| 0.7736111111111111 | 38.653 |
| 0.7743055555555555 | 38.653 |
| 0.775 | 38.653 |
| 0.7756944444444445 | 38.653 |
| 0.7763888888888889 | 38.653 |
| 0.7770833333333332 | 34.234 |
| 0.7777777777777778 | 34.234 |
| 0.7784722222222222 | 34.234 |
| 0.7791666666666667 | 34.234 |
| 0.779861111111111 | 29.823 |
| 0.7805555555555556 | 29.823 |
| 0.78125 | 29.823 |
| 0.7819444444444444 | 29.823 |
| 0.782638888888889 | 29.823 |
| 0.7833333333333333 | 29.823 |
| 0.7840277777777778 | 25.419 |
| 0.7847222222222222 | 25.419 |
| 0.7854166666666668 | 25.419 |
| 0.7861111111111111 | 25.419 |
| 0.7868055555555555 | 21.024 |
| 0.7875 | 21.024 |
| 0.7881944444444445 | 21.024 |
| 0.7888888888888889 | 21.024 |
| 0.7895833333333333 | 21.024 |
| 0.7902777777777777 | 16.636 |
| 0.7909722222222223 | 16.636 |
| 0.7916666666666666 | 16.636 |
| 0.7923611111111111 | 16.636 |
| 0.7930555555555556 | 12.257 |
| 0.7937500000000001 | 12.257 |
| 0.7944444444444444 | 12.257 |
| 0.7951388888888888 | 12.257 |
| 0.7958333333333334 | 12.257 |
| 0.7965277777777778 | 7.887 |
| 0.7972222222222222 | 7.887 |
| 0.7979166666666666 | 7.887 |
| 0.7986111111111112 | 7.887 |
| 0.7993055555555556 | 7.887 |
| 0.7999999999999999 | 3.525 |
| 0.8006944444444444 | 3.525 |
| 0.8013888888888889 | 3.525 |
| 0.8020833333333334 | 3.525 |
| 0.8027777777777777 | 3.525 |
| 0.8034722222222223 | 3.525 |
| 0.8041666666666667 | 3.525 |
| 0.8048611111111111 | 3.525 |
| 0.8055555555555555 | 3.525 |
| 0.80625 | 0 |
| 0.8069444444444445 | 0 |
| 0.8076388888888889 | 0 |
| 0.8083333333333332 | 0 |
| 0.8090277777777778 | 0 |
| 0.8097222222222222 | 0 |
| 0.8104166666666667 | 0 |
| 0.811111111111111 | 0 |
| 0.8118055555555556 | 0 |
| 0.8125 | 0 |
| 0.8131944444444444 | 0 |
| 0.813888888888889 | 0 |
| 0.8145833333333333 | 0 |
| 0.8152777777777778 | 0 |
| 0.8159722222222222 | 0 |
| 0.8166666666666668 | 0 |
| 0.8173611111111111 | 0 |
| 0.8180555555555555 | 0 |
| 0.81875 | 0 |
| 0.8194444444444445 | 0 |
| 0.8201388888888889 | 0 |
| 0.8208333333333333 | 0 |
| 0.8215277777777777 | 0 |
| 0.8222222222222223 | 0 |
| 0.8229166666666666 | 0 |
| 0.8236111111111111 | 0 |
| 0.8243055555555556 | 0 |
| 0.8250000000000001 | 0 |
| 0.8256944444444444 | 0 |
| 0.8263888888888888 | 0 |
| 0.8270833333333334 | 0 |
| 0.8277777777777778 | 0 |
| 0.8284722222222222 | 0 |
| 0.8291666666666666 | 0 |
| 0.8298611111111112 | 0 |
| 0.8305555555555556 | 0 |
| 0.8312499999999999 | 0 |
| 0.8319444444444444 | 0 |
| 0.8326388888888889 | 0 |
| 0.8333333333333334 | 0 |
| 0.8340277777777777 | 0 |
| 0.8347222222222223 | 0 |
| 0.8354166666666667 | 0 |
| 0.8361111111111111 | 0 |
| 0.8368055555555555 | 0 |
| 0.8375 | 0 |
| 0.8381944444444445 | 0 |
| 0.8388888888888889 | 0 |
| 0.8395833333333332 | 0 |
| 0.8402777777777778 | 0 |
| 0.8409722222222222 | 0 |
| 0.8416666666666667 | 0 |
| 0.842361111111111 | 0 |
| 0.8430555555555556 | 0 |
| 0.84375 | 0 |
| 0.8444444444444444 | 0 |
| 0.845138888888889 | 0 |
| 0.8458333333333333 | 0 |
| 0.8465277777777778 | 0 |
| 0.8472222222222222 | 0 |
| 0.8479166666666668 | 0 |
| 0.8486111111111111 | 0 |
| 0.8493055555555555 | 0 |
| 0.85 | 0 |
| 0.8506944444444445 | 0 |
| 0.8513888888888889 | 0 |
| 0.8520833333333333 | 0 |
| 0.8527777777777777 | 0 |
| 0.8534722222222223 | 0 |
| 0.8541666666666666 | 0 |
| 0.8548611111111111 | 0 |
| 0.8555555555555556 | 0 |
| 0.8562500000000001 | 0 |
| 0.8569444444444444 | 0 |
| 0.8576388888888888 | 0 |
| 0.8583333333333334 | 0 |
| 0.8590277777777778 | 0 |
| 0.8597222222222222 | 0 |
| 0.8604166666666666 | 0 |
| 0.8611111111111112 | 0 |
| 0.8618055555555556 | 0 |
| 0.8624999999999999 | 0 |
| 0.8631944444444444 | 0 |
| 0.8638888888888889 | 0 |
| 0.8645833333333334 | 0 |
| 0.8652777777777777 | 0 |
| 0.8659722222222223 | 0 |
| 0.8666666666666667 | 0 |
| 0.8673611111111111 | 0 |
| 0.8680555555555555 | 0 |
| 0.86875 | 0 |
| 0.8694444444444445 | 0 |
| 0.8701388888888889 | 0 |
| 0.8708333333333332 | 0 |
| 0.8715277777777778 | 0 |
| 0.8722222222222222 | 0 |
| 0.8729166666666667 | 0 |
| 0.873611111111111 | 0 |
| 0.8743055555555556 | 0 |
| 0.875 | 0 |
| 0.8756944444444444 | 0 |
| 0.876388888888889 | 0 |
| 0.8770833333333333 | 0 |
| 0.8777777777777778 | 0 |
| 0.8784722222222222 | 0 |
| 0.8791666666666668 | 0 |
| 0.8798611111111111 | 0 |
| 0.8805555555555555 | 0 |
| 0.88125 | 0 |
| 0.8819444444444445 | 0 |
| 0.8826388888888889 | 0 |
| 0.8833333333333333 | 0 |
| 0.8840277777777777 | 0 |
| 0.8847222222222223 | 0 |
| 0.8854166666666666 | 0 |
| 0.8861111111111111 | 0 |
| 0.8868055555555556 | 0 |
| 0.8875000000000001 | 0 |
| 0.8881944444444444 | 0 |
| 0.8888888888888888 | 0 |
| 0.8895833333333334 | 0 |
| 0.8902777777777778 | 0 |
| 0.8909722222222222 | 0 |
| 0.8916666666666666 | 0 |
| 0.8923611111111112 | 0 |
| 0.8930555555555556 | 0 |
| 0.8937499999999999 | 0 |
| 0.8944444444444444 | 0 |
| 0.8951388888888889 | 0 |
| 0.8958333333333334 | 0 |
| 0.8965277777777777 | 0 |
| 0.8972222222222223 | 0 |
| 0.8979166666666667 | 0 |
| 0.8986111111111111 | 0 |
| 0.8993055555555555 | 0 |
| 0.9 | 0 |
| 0.9006944444444445 | 0 |
| 0.9013888888888889 | 0 |
| 0.9020833333333332 | 0 |
| 0.9027777777777778 | 0 |
| 0.9034722222222222 | 0 |
| 0.9041666666666667 | 0 |
| 0.904861111111111 | 0 |
| 0.9055555555555556 | 0 |
| 0.90625 | 0 |
| 0.9069444444444444 | 0 |
| 0.907638888888889 | 0 |
| 0.9083333333333333 | 0 |
| 0.9090277777777778 | 0 |
| 0.9097222222222222 | 0 |
| 0.9104166666666668 | 0 |
| 0.9111111111111111 | 0 |
| 0.9118055555555555 | 0 |
| 0.9125 | 0 |
| 0.9131944444444445 | 0 |
| 0.9138888888888889 | 0 |
| 0.9145833333333333 | 0 |
| 0.9152777777777777 | 0 |
| 0.9159722222222223 | 0 |
| 0.9166666666666666 | 0 |
| 0.9173611111111111 | 0 |
| 0.9180555555555556 | 0 |
| 0.9187500000000001 | 0 |
| 0.9194444444444444 | 0 |
| 0.9201388888888888 | 0 |
| 0.9208333333333334 | 0 |
| 0.9215277777777778 | 0 |
| 0.9222222222222222 | 0 |
| 0.9229166666666666 | 0 |
| 0.9236111111111112 | 0 |
| 0.9243055555555556 | 0 |
| 0.9249999999999999 | 0 |
| 0.9256944444444444 | 0 |
| 0.9263888888888889 | 0 |
| 0.9270833333333334 | 0 |
| 0.9277777777777777 | 0 |
| 0.9284722222222223 | 0 |
| 0.9291666666666667 | 0 |
| 0.9298611111111111 | 0 |
| 0.9305555555555555 | 0 |
| 0.93125 | 0 |
| 0.9319444444444445 | 0 |
| 0.9326388888888889 | 0 |
| 0.9333333333333332 | 0 |
| 0.9340277777777778 | 0 |
| 0.9347222222222222 | 0 |
| 0.9354166666666667 | 0 |
| 0.936111111111111 | 0 |
| 0.9368055555555556 | 0 |
| 0.9375 | 0 |
| 0.9381944444444444 | 0 |
| 0.938888888888889 | 0 |
| 0.9395833333333333 | 0 |
| 0.9402777777777778 | 0 |
| 0.9409722222222222 | 0 |
| 0.9416666666666668 | 0 |
| 0.9423611111111111 | 0 |
| 0.9430555555555555 | 0 |
| 0.94375 | 0 |
| 0.9444444444444445 | 0 |
| 0.9451388888888889 | 0 |
| 0.9458333333333333 | 0 |
| 0.9465277777777777 | 0 |
| 0.9472222222222223 | 0 |
| 0.9479166666666666 | 0 |
| 0.9486111111111111 | 0 |
| 0.9493055555555556 | 0 |
| 0.9500000000000001 | 0 |
| 0.9506944444444444 | 0 |
| 0.9513888888888888 | 0 |
| 0.9520833333333334 | 0 |
| 0.9527777777777778 | 0 |
| 0.9534722222222222 | 0 |
| 0.9541666666666666 | 0 |
| 0.9548611111111112 | 0 |
| 0.9555555555555556 | 0 |
| 0.9562499999999999 | 0 |
| 0.9569444444444444 | 0 |
| 0.9576388888888889 | 0 |
| 0.9583333333333334 | 0 |
| 0.9590277777777777 | 0 |
| 0.9597222222222223 | 0 |
| 0.9604166666666667 | 0 |
| 0.9611111111111111 | 0 |
| 0.9618055555555555 | 0 |
| 0.9625 | 0 |
| 0.9631944444444445 | 0 |
| 0.9638888888888889 | 0 |
| 0.9645833333333332 | 0 |
| 0.9652777777777778 | 0 |
| 0.9659722222222222 | 0 |
| 0.9666666666666667 | 0 |
| 0.967361111111111 | 0 |
| 0.9680555555555556 | 0 |
| 0.96875 | 0 |
| 0.9694444444444444 | 0 |
| 0.970138888888889 | 0 |
| 0.9708333333333333 | 0 |
| 0.9715277777777778 | 0 |
| 0.9722222222222222 | 0 |
| 0.9729166666666668 | 0 |
| 0.9736111111111111 | 0 |
| 0.9743055555555555 | 0 |
| 0.975 | 0 |
| 0.9756944444444445 | 0 |
| 0.9763888888888889 | 0 |
| 0.9770833333333333 | 0 |
| 0.9777777777777777 | 0 |
| 0.9784722222222223 | 0 |
| 0.9791666666666666 | 0 |
| 0.9798611111111111 | 0 |
| 0.9805555555555556 | 0 |
| 0.9812500000000001 | 0 |
| 0.9819444444444444 | 0 |
| 0.9826388888888888 | 0 |
| 0.9833333333333334 | 0 |
| 0.9840277777777778 | 0 |
| 0.9847222222222222 | 0 |
| 0.9854166666666666 | 0 |
| 0.9861111111111112 | 0 |
| 0.9868055555555556 | 0 |
| 0.9874999999999999 | 0 |
| 0.9881944444444444 | 0 |
| 0.9888888888888889 | 0 |
| 0.9895833333333334 | 0 |
| 0.9902777777777777 | 0 |
| 0.9909722222222223 | 0 |
| 0.9916666666666667 | 0 |
| 0.9923611111111111 | 0 |
| 0.9930555555555555 | 0 |
| 0.99375 | 0 |
| 0.9944444444444445 | 0 |
| 0.9951388888888889 | 0 |
| 0.9958333333333332 | 0 |
| 0.9965277777777778 | 0 |
| 0.9972222222222222 | 0 |
| 0.9979166666666667 | 0 |
| 0.998611111111111 | 0 |
| 0.9993055555555556 | 0 |